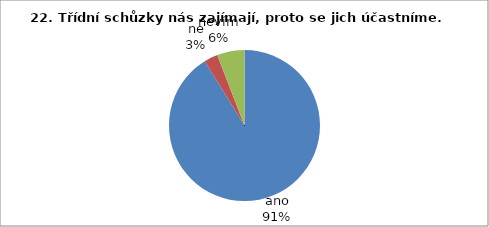
| Category | 22. |
|---|---|
| ano | 31 |
| ne | 1 |
| nevím | 2 |